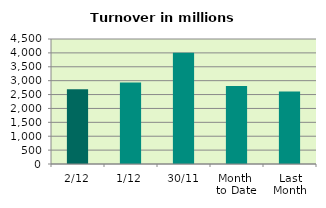
| Category | Series 0 |
|---|---|
| 2/12 | 2687.404 |
| 1/12 | 2935.275 |
| 30/11 | 4006.797 |
| Month 
to Date | 2811.339 |
| Last
Month | 2611.78 |